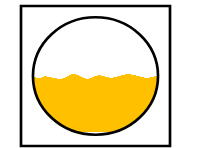
| Category | Series 0 | Series 1 | Series 2 |
|---|---|---|---|
| 0 | 0.45 | 0.05 | 0.5 |